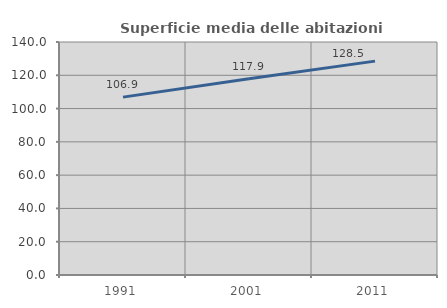
| Category | Superficie media delle abitazioni occupate |
|---|---|
| 1991.0 | 106.875 |
| 2001.0 | 117.857 |
| 2011.0 | 128.506 |